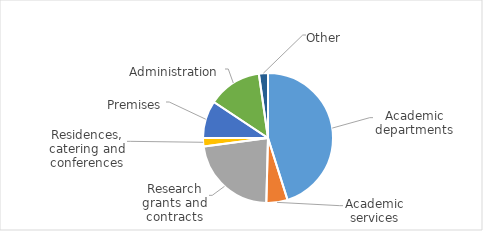
| Category | Series 0 |
|---|---|
| Academic departments | 150396 |
| Academic services | 17627 |
| Research grants and contracts | 74958 |
| Residences, catering and conferences | 6927 |
| Premises | 31146 |
| Administration  | 44697 |
| Other | 7512 |